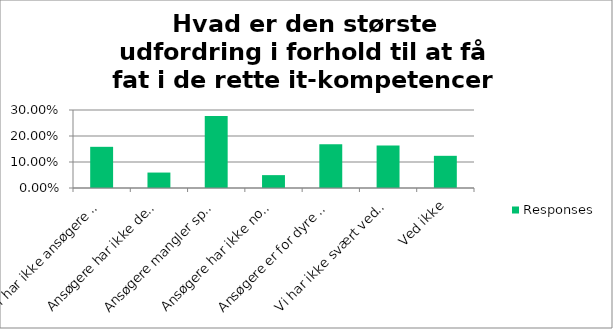
| Category | Responses |
|---|---|
| Vi har ikke ansøgere til stillingerne | 0.158 |
| Ansøgere har ikke den rette uddannelse | 0.059 |
| Ansøgere mangler specifikke spidskompetencer | 0.277 |
| Ansøgere har ikke nok erhvervserfaring | 0.05 |
| Ansøgere er for dyre i løn | 0.168 |
| Vi har ikke svært ved at skaffe folk med de rette it-kompetencer | 0.163 |
| Ved ikke | 0.124 |